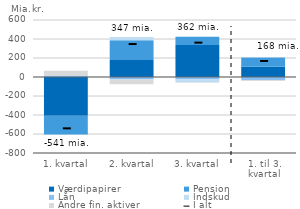
| Category | Værdipapirer | Pension | Lån | Indskud | Andre fin. aktiver |
|---|---|---|---|---|---|
| 1. kvartal | -409.09 | -196.948 | 15.503 | 1.579 | 48.336 |
| 2. kvartal | 178.148 | 208.897 | -25.394 | 35.189 | -49.977 |
| 3. kvartal | 337.92 | 86.928 | -25.374 | -33.609 | -3.991 |
| 1. til 3. kvartal | 106.978 | 98.877 | -35.265 | 3.159 | -5.632 |